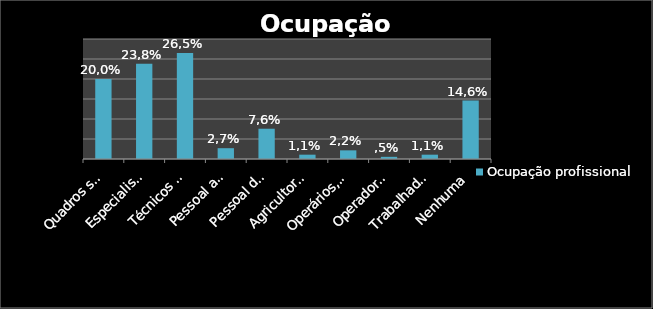
| Category | Ocupação profissional |
|---|---|
| Quadros superiores de administração pública, dirigentes e quadros superiores de empresa | 20 |
| Especialista das profissões intelectuais e científicas | 23.784 |
| Técnicos e profissionais de nível intermédio | 26.486 |
| Pessoal administrativo e similares | 2.703 |
| Pessoal dos serviços e vendedores | 7.568 |
| Agricultores e trabalhadores qualificados da agricultura e pescas | 1.081 |
| Operários, artífices e trabalhadores similares | 2.162 |
| Operadores de instalações e máquinas e trabalhadores da montagem | 0.541 |
| Trabalhadores não qualificados | 1.081 |
| Nenhuma | 14.595 |